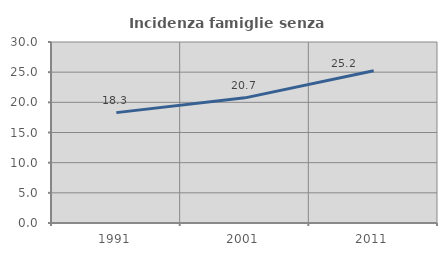
| Category | Incidenza famiglie senza nuclei |
|---|---|
| 1991.0 | 18.293 |
| 2001.0 | 20.744 |
| 2011.0 | 25.242 |